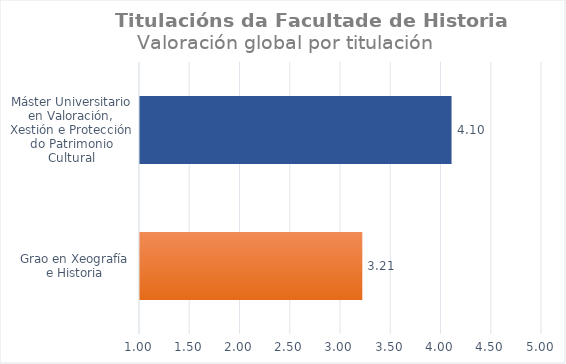
| Category | Series 0 |
|---|---|
| Grao en Xeografía e Historia | 3.212 |
| Máster Universitario en Valoración, Xestión e Protección do Patrimonio Cultural | 4.1 |